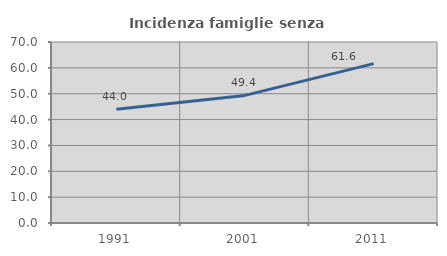
| Category | Incidenza famiglie senza nuclei |
|---|---|
| 1991.0 | 44 |
| 2001.0 | 49.351 |
| 2011.0 | 61.644 |